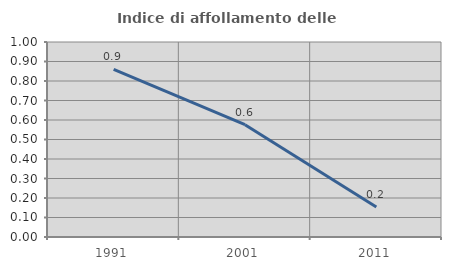
| Category | Indice di affollamento delle abitazioni  |
|---|---|
| 1991.0 | 0.86 |
| 2001.0 | 0.576 |
| 2011.0 | 0.154 |